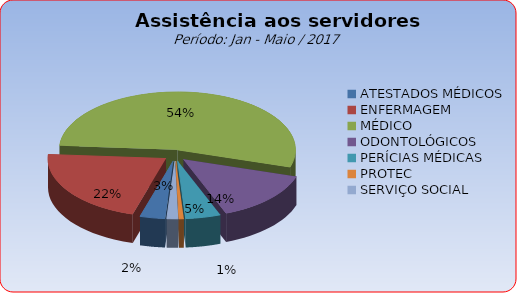
| Category | Series 0 |
|---|---|
| ATESTADOS MÉDICOS | 3.433 |
| ENFERMAGEM | 21.577 |
| MÉDICO | 53.678 |
| ODONTOLÓGICOS | 14.334 |
| PERÍCIAS MÉDICAS | 4.791 |
| PROTEC | 0.641 |
| SERVIÇO SOCIAL | 1.547 |